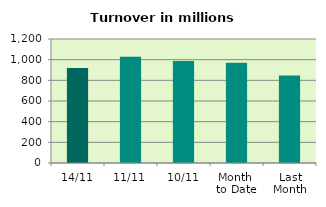
| Category | Series 0 |
|---|---|
| 14/11 | 918.522 |
| 11/11 | 1028.759 |
| 10/11 | 987.324 |
| Month 
to Date | 971.038 |
| Last
Month | 847.422 |